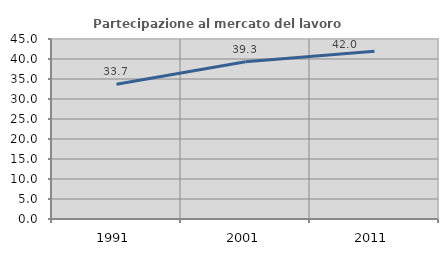
| Category | Partecipazione al mercato del lavoro  femminile |
|---|---|
| 1991.0 | 33.687 |
| 2001.0 | 39.304 |
| 2011.0 | 41.954 |